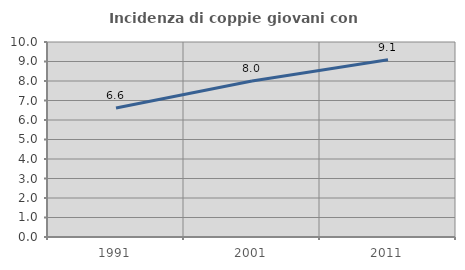
| Category | Incidenza di coppie giovani con figli |
|---|---|
| 1991.0 | 6.612 |
| 2001.0 | 8 |
| 2011.0 | 9.091 |